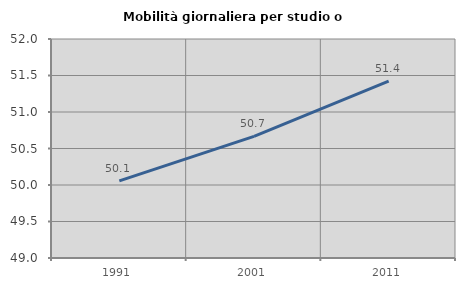
| Category | Mobilità giornaliera per studio o lavoro |
|---|---|
| 1991.0 | 50.057 |
| 2001.0 | 50.667 |
| 2011.0 | 51.422 |